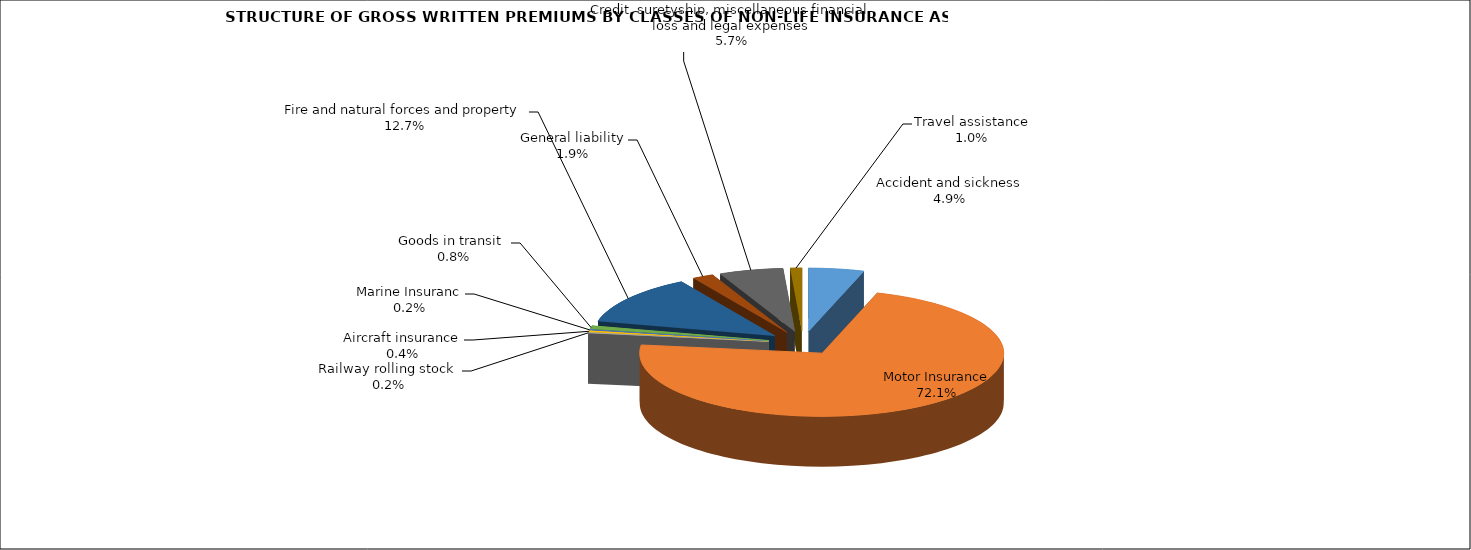
| Category | Accident and sickness |
|---|---|
| Accident and sickness | 0.049 |
| Motor Insurance | 0.721 |
| Railway rolling stock  | 0.002 |
| Aircraft insurance | 0.004 |
| Marine Insuranc | 0.002 |
| Goods in transit  | 0.008 |
| Fire and natural forces and property | 0.127 |
| General liability | 0.019 |
| Credit, suretyship, miscellaneous financial loss and legal expenses | 0.057 |
| Travel assistance | 0.01 |